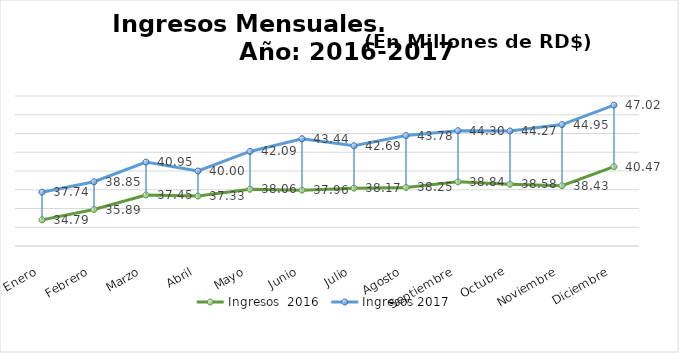
| Category | Ingresos  2016 | Ingresos 2017 |
|---|---|---|
| Enero | 34.786 | 37.743 |
| Febrero | 35.892 | 38.852 |
| Marzo | 37.447 | 40.952 |
| Abril | 37.327 | 39.999 |
| Mayo | 38.057 | 42.088 |
| Junio | 37.955 | 43.442 |
| Julio | 38.173 | 42.689 |
| Agosto | 38.248 | 43.776 |
| Septiembre | 38.844 | 44.299 |
| Octubre | 38.581 | 44.272 |
| Noviembre | 38.43 | 44.948 |
| Diciembre | 40.466 | 47.024 |